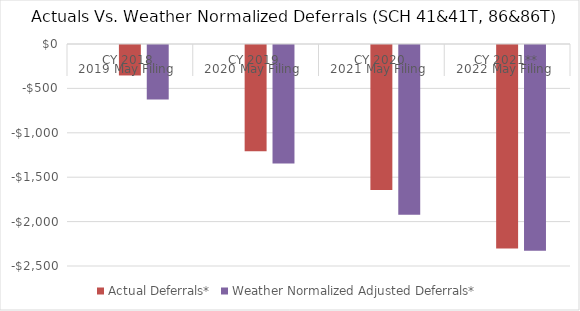
| Category | Residential: SCH 23&53 | Actual Deferrals* | Weather Normalized Adjusted Deferrals* |
|---|---|---|---|
| 0 |  | -343.22 | -612.609 |
| 1 |  | -1195.826 | -1335.068 |
| 2 |  | -1633.796 | -1910.547 |
| 3 |  | -2290.83 | -2315.613 |